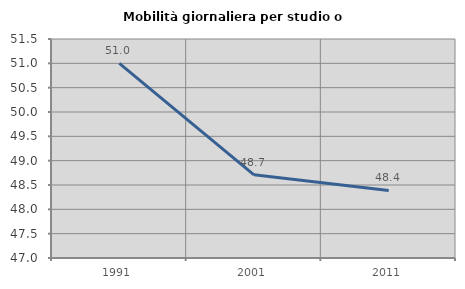
| Category | Mobilità giornaliera per studio o lavoro |
|---|---|
| 1991.0 | 51 |
| 2001.0 | 48.708 |
| 2011.0 | 48.387 |